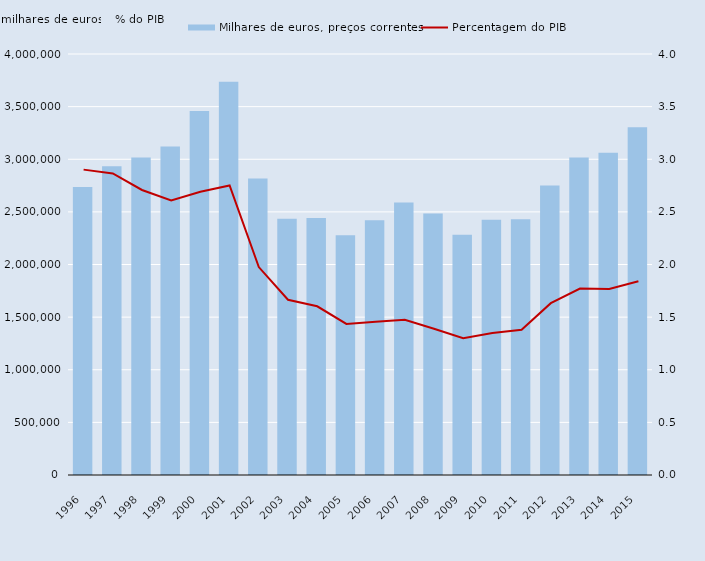
| Category | Milhares de euros, preços correntes |
|---|---|
| 1996.0 | 2737490 |
| 1997.0 | 2932550 |
| 1998.0 | 3016290 |
| 1999.0 | 3121680 |
| 2000.0 | 3458120 |
| 2001.0 | 3736820 |
| 2002.0 | 2817880 |
| 2003.0 | 2433780 |
| 2004.0 | 2442160 |
| 2005.0 | 2277250 |
| 2006.0 | 2420270 |
| 2007.0 | 2588420 |
| 2008.0 | 2484680 |
| 2009.0 | 2281870 |
| 2010.0 | 2425900 |
| 2011.0 | 2430490 |
| 2012.0 | 2749460 |
| 2013.0 | 3015780 |
| 2014.0 | 3060710 |
| 2015.0 | 3303650 |